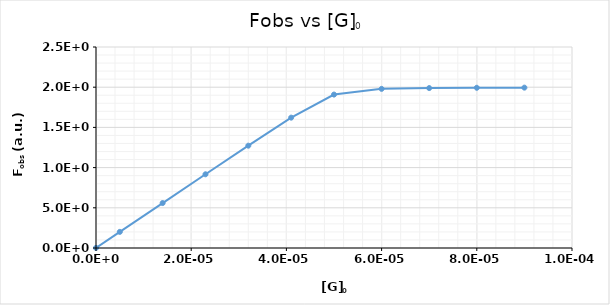
| Category | Fobs |
|---|---|
| 0.0 | 1000 |
| 5e-06 | 200411.569 |
| 1.4000000000000001e-05 | 559013.091 |
| 2.3000000000000003e-05 | 916813.256 |
| 3.2000000000000005e-05 | 1272653.566 |
| 4.100000000000001e-05 | 1621319.48 |
| 5e-05 | 1908309.658 |
| 6e-05 | 1979264.808 |
| 7e-05 | 1989186.252 |
| 7.999999999999999e-05 | 1992724.468 |
| 8.999999999999999e-05 | 1994524.042 |